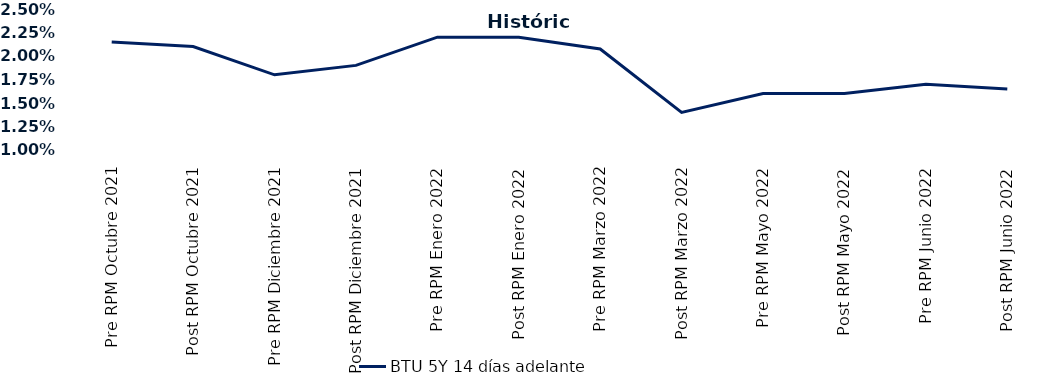
| Category | BTU 5Y 14 días adelante |
|---|---|
| Pre RPM Octubre 2021 | 0.022 |
| Post RPM Octubre 2021 | 0.021 |
| Pre RPM Diciembre 2021 | 0.018 |
| Post RPM Diciembre 2021 | 0.019 |
| Pre RPM Enero 2022 | 0.022 |
| Post RPM Enero 2022 | 0.022 |
| Pre RPM Marzo 2022 | 0.021 |
| Post RPM Marzo 2022 | 0.014 |
| Pre RPM Mayo 2022 | 0.016 |
| Post RPM Mayo 2022 | 0.016 |
| Pre RPM Junio 2022 | 0.017 |
| Post RPM Junio 2022 | 0.016 |